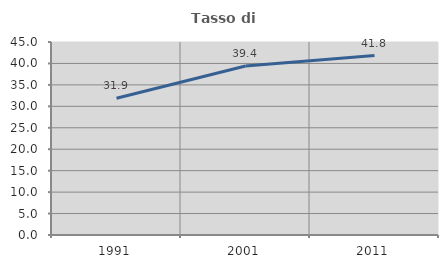
| Category | Tasso di occupazione   |
|---|---|
| 1991.0 | 31.897 |
| 2001.0 | 39.394 |
| 2011.0 | 41.839 |